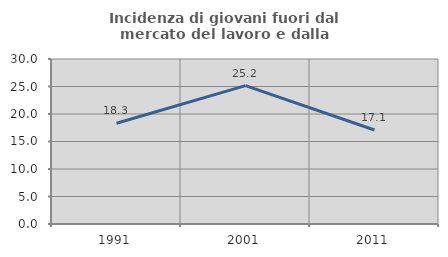
| Category | Incidenza di giovani fuori dal mercato del lavoro e dalla formazione  |
|---|---|
| 1991.0 | 18.323 |
| 2001.0 | 25.162 |
| 2011.0 | 17.093 |